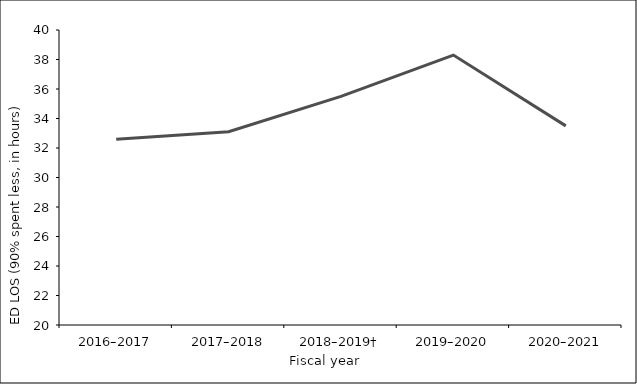
| Category | Series 0 |
|---|---|
| 2016–2017 | 32.6 |
| 2017–2018 | 33.1 |
| 2018–2019† | 35.5 |
| 2019–2020 | 38.3 |
| 2020–2021 | 33.5 |